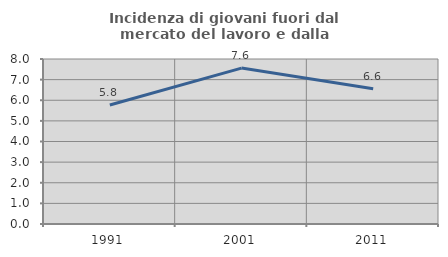
| Category | Incidenza di giovani fuori dal mercato del lavoro e dalla formazione  |
|---|---|
| 1991.0 | 5.767 |
| 2001.0 | 7.559 |
| 2011.0 | 6.561 |